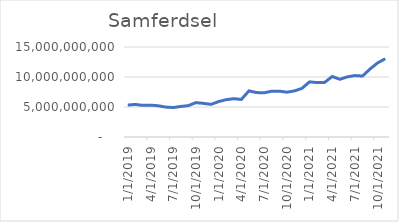
| Category | Samferdsel |
|---|---|
| 1/1/19 | 5329972083.333 |
| 2/1/19 | 5428951250 |
| 3/1/19 | 5271597083.333 |
| 4/1/19 | 5303790833.333 |
| 5/1/19 | 5210920000 |
| 6/1/19 | 4985532500 |
| 7/1/19 | 4914782500 |
| 8/1/19 | 5086278333.333 |
| 9/1/19 | 5232386666.667 |
| 10/1/19 | 5733895000 |
| 11/1/19 | 5604320000 |
| 12/1/19 | 5441028333.333 |
| 1/1/20 | 5905375000 |
| 2/1/20 | 6222850000 |
| 3/1/20 | 6384495833.333 |
| 4/1/20 | 6258104166.667 |
| 5/1/20 | 7684354166.667 |
| 6/1/20 | 7404487500 |
| 7/1/20 | 7367320833.333 |
| 8/1/20 | 7633429166.667 |
| 9/1/20 | 7640804166.667 |
| 10/1/20 | 7469725000 |
| 11/1/20 | 7683700000 |
| 12/1/20 | 8104575000 |
| 1/1/21 | 9186008333.333 |
| 2/1/21 | 9074641666.667 |
| 3/1/21 | 9104116666.667 |
| 4/1/21 | 10081966666.667 |
| 5/1/21 | 9618200000 |
| 6/1/21 | 10021304166.667 |
| 7/1/21 | 10240595833.333 |
| 8/1/21 | 10162554166.667 |
| 9/1/21 | 11335283333.333 |
| 10/1/21 | 12353600000 |
| 11/1/21 | 13045504166.667 |